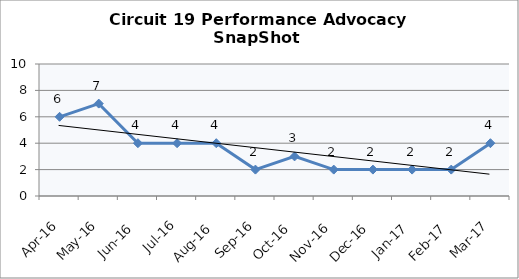
| Category | Circuit 19 |
|---|---|
| Apr-16 | 6 |
| May-16 | 7 |
| Jun-16 | 4 |
| Jul-16 | 4 |
| Aug-16 | 4 |
| Sep-16 | 2 |
| Oct-16 | 3 |
| Nov-16 | 2 |
| Dec-16 | 2 |
| Jan-17 | 2 |
| Feb-17 | 2 |
| Mar-17 | 4 |